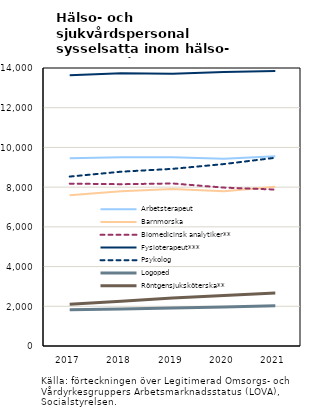
| Category | Arbetsterapeut | Barnmorska | Biomedicinsk analytiker** | Fysioterapeut*** | Psykolog | Logoped | Röntgensjuksköterska** |
|---|---|---|---|---|---|---|---|
| 2017.0 | 9452 | 7596 | 8175 | 13641 | 8533 | 1828 | 2097 |
| 2018.0 | 9511 | 7791 | 8148 | 13741 | 8778 | 1866 | 2259 |
| 2019.0 | 9503 | 7908 | 8185 | 13710 | 8921 | 1910 | 2412 |
| 2020.0 | 9426 | 7793 | 7977 | 13801 | 9162 | 1965 | 2549 |
| 2021.0 | 9550 | 8015 | 7878 | 13850 | 9479 | 2023 | 2668 |